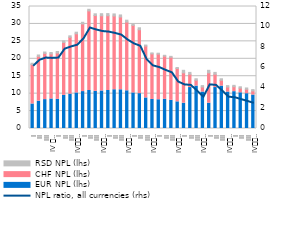
| Category | EUR NPL (lhs) | CHF NPL (lhs) | RSD NPL (lhs) |
|---|---|---|---|
| I | 7.031 | 11.315 | 0.376 |
| II | 7.838 | 12.854 | 0.398 |
| III | 8.287 | 13.256 | 0.398 |
| IV 
2013 | 8.472 | 12.907 | 0.424 |
| I | 8.364 | 13.289 | 0.434 |
| II | 9.502 | 15.183 | 0.445 |
| III | 9.861 | 16.293 | 0.431 |
| IV
2014 | 10.2 | 16.966 | 0.464 |
| I | 10.588 | 19.402 | 0.479 |
| II | 10.907 | 22.828 | 0.467 |
| III | 10.661 | 21.759 | 0.479 |
| IV
2015 | 10.774 | 21.561 | 0.595 |
| I | 10.906 | 21.449 | 0.603 |
| II | 11.118 | 21.151 | 0.6 |
| III | 11.109 | 20.882 | 0.585 |
| IV
2016 | 10.82 | 19.717 | 0.539 |
| I | 10.204 | 19.386 | 0.539 |
| II | 10.002 | 18.325 | 0.564 |
| III | 8.771 | 14.875 | 0.29 |
| IV
2017 | 8.337 | 13.073 | 0.274 |
| I | 8.247 | 13.09 | 0.266 |
| II | 8.373 | 12.384 | 0.241 |
| III | 8.081 | 12.357 | 0.265 |
| IV
2018 | 7.649 | 9.577 | 0.27 |
| I | 7.26 | 8.704 | 0.728 |
| II | 11.747 | 3.816 | 0.533 |
| III | 12.162 | 1.673 | 0.43 |
| IV
2019 | 10.454 | 1.442 | 0.401 |
| I | 7.26 | 8.704 | 0.728 |
| II | 11.747 | 3.816 | 0.533 |
| III | 12.162 | 1.673 | 0.43 |
| IV
2019 | 10.454 | 1.442 | 0.401 |
| I | 10.571 | 1.411 | 0.399 |
| II | 10.24 | 1.341 | 0.391 |
| III | 9.985 | 1.262 | 0.38 |
| IV
2020 | 9.601 | 1.174 | 0.387 |